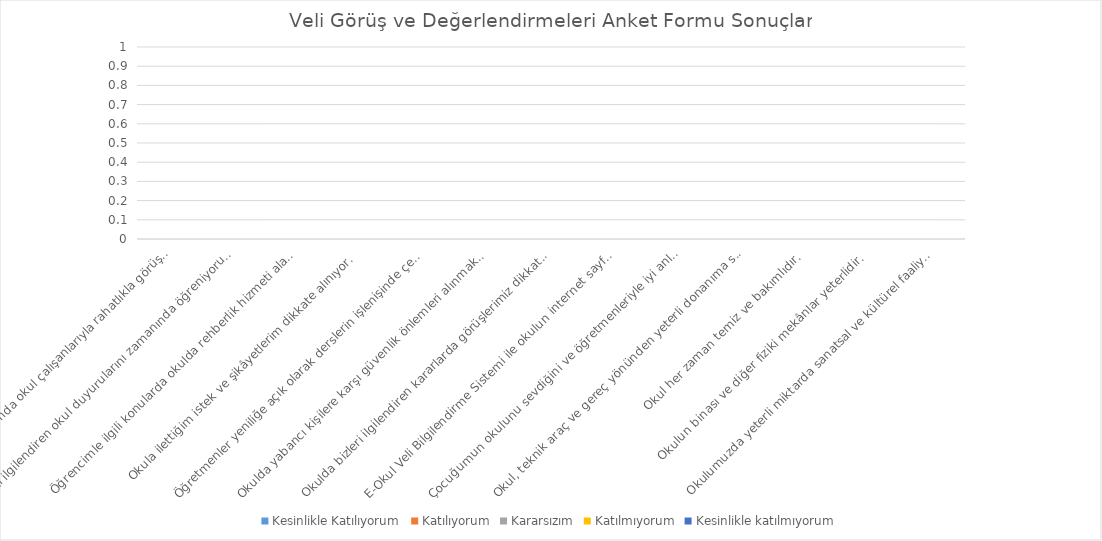
| Category | Kesinlikle Katılıyorum | Katılıyorum | Kararsızım | Katılmıyorum | Kesinlikle katılmıyorum |
|---|---|---|---|---|---|
| İhtiyaç duyduğumda okul çalışanlarıyla rahatlıkla görüşebiliyorum. | 0 | 0 | 0 | 0 | 0 |
| Bizi ilgilendiren okul duyurularını zamanında öğreniyorum. | 0 | 0 | 0 | 0 | 0 |
| Öğrencimle ilgili konularda okulda rehberlik hizmeti alabiliyorum. | 0 | 0 | 0 | 0 | 0 |
| Okula ilettiğim istek ve şikâyetlerim dikkate alınıyor. | 0 | 0 | 0 | 0 | 0 |
| Öğretmenler yeniliğe açık olarak derslerin işlenişinde çeşitli yöntemler kullanmaktadır. | 0 | 0 | 0 | 0 | 0 |
| Okulda yabancı kişilere karşı güvenlik önlemleri alınmaktadır. | 0 | 0 | 0 | 0 | 0 |
| Okulda bizleri ilgilendiren kararlarda görüşlerimiz dikkate alınır. | 0 | 0 | 0 | 0 | 0 |
| E-Okul Veli Bilgilendirme Sistemi ile okulun internet sayfasını düzenli olarak takip ediyorum. | 0 | 0 | 0 | 0 | 0 |
| Çocuğumun okulunu sevdiğini ve öğretmenleriyle iyi anlaştığını düşünüyorum. | 0 | 0 | 0 | 0 | 0 |
| Okul, teknik araç ve gereç yönünden yeterli donanıma sahiptir. | 0 | 0 | 0 | 0 | 0 |
| Okul her zaman temiz ve bakımlıdır. | 0 | 0 | 0 | 0 | 0 |
| Okulun binası ve diğer fiziki mekânlar yeterlidir. | 0 | 0 | 0 | 0 | 0 |
| Okulumuzda yeterli miktarda sanatsal ve kültürel faaliyetler düzenlenmektedir. | 0 | 0 | 0 | 0 | 0 |